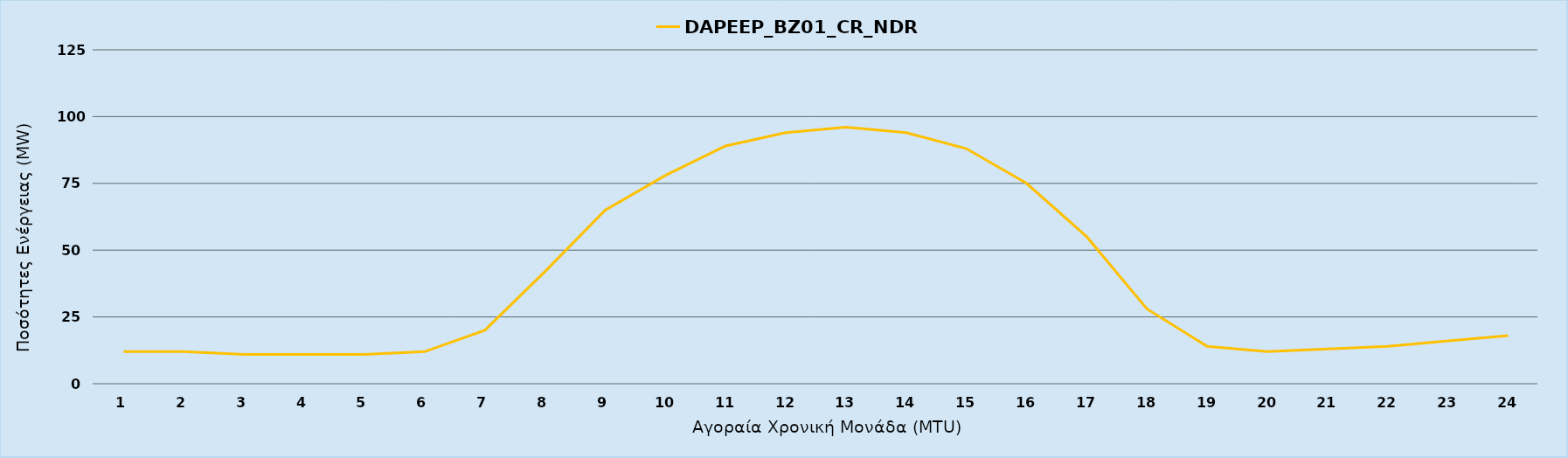
| Category | DAPEEP_BZ01_CR_NDR |
|---|---|
| 0 | 12 |
| 1 | 12 |
| 2 | 11 |
| 3 | 11 |
| 4 | 11 |
| 5 | 12 |
| 6 | 20 |
| 7 | 42 |
| 8 | 65 |
| 9 | 78 |
| 10 | 89 |
| 11 | 94 |
| 12 | 96 |
| 13 | 94 |
| 14 | 88 |
| 15 | 75 |
| 16 | 55 |
| 17 | 28 |
| 18 | 14 |
| 19 | 12 |
| 20 | 13 |
| 21 | 14 |
| 22 | 16 |
| 23 | 18 |